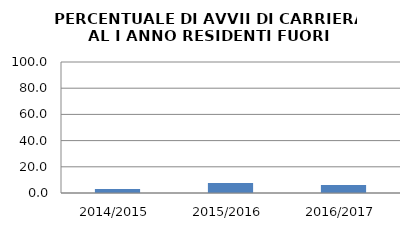
| Category | 2014/2015 2015/2016 2016/2017 |
|---|---|
| 2014/2015 | 3.125 |
| 2015/2016 | 7.547 |
| 2016/2017 | 6.122 |